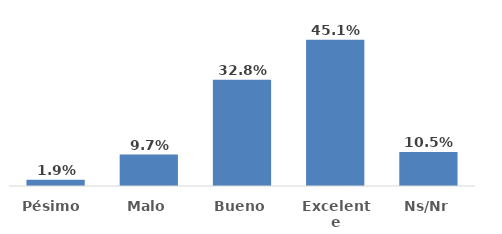
| Category | Series 0 |
|---|---|
| Pésimo  | 0.019 |
| Malo | 0.097 |
| Bueno | 0.328 |
| Excelente | 0.451 |
| Ns/Nr | 0.105 |